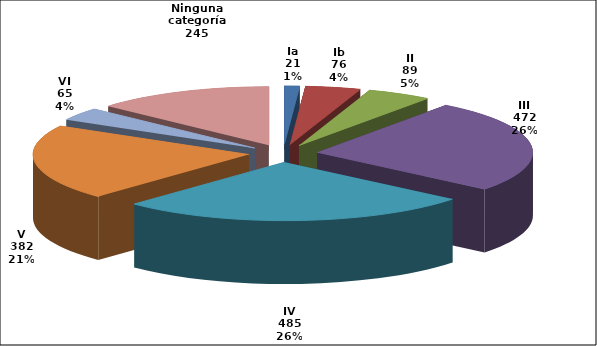
| Category | Series 0 |
|---|---|
| Ia | 21 |
| Ib | 76 |
| II | 89 |
| III | 472 |
| IV | 485 |
| V | 382 |
| VI | 65 |
| Ninguna categoría | 245 |